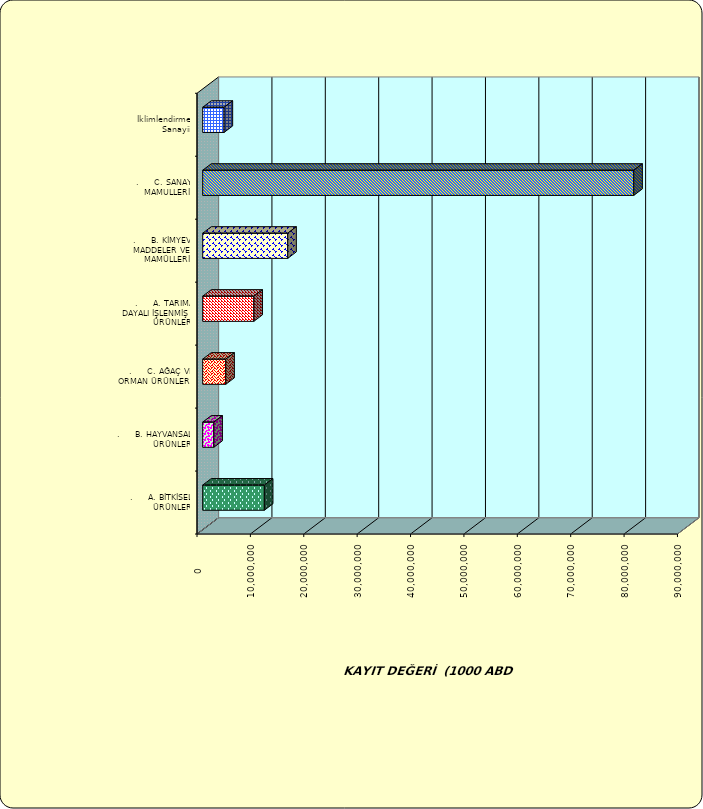
| Category | Series 0 |
|---|---|
| .     A. BİTKİSEL ÜRÜNLER | 11548002.668 |
| .     B. HAYVANSAL ÜRÜNLER | 2082758.988 |
| .     C. AĞAÇ VE ORMAN ÜRÜNLERİ | 4322651.25 |
| .     A. TARIMA DAYALI İŞLENMİŞ ÜRÜNLER | 9583975.909 |
| .     B. KİMYEVİ MADDELER VE MAMÜLLERİ | 15930376.939 |
| .     C. SANAYİ MAMULLERİ | 80750093.912 |
|  İklimlendirme Sanayii | 4001777.068 |